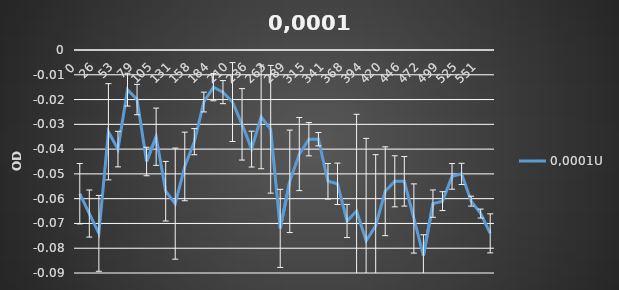
| Category | 0,0001U |
|---|---|
| 0.0 | -0.058 |
| 13.0 | -0.066 |
| 26.0 | -0.074 |
| 39.0 | -0.033 |
| 53.0 | -0.04 |
| 66.0 | -0.016 |
| 79.0 | -0.02 |
| 92.0 | -0.045 |
| 105.0 | -0.035 |
| 118.0 | -0.057 |
| 131.0 | -0.062 |
| 144.0 | -0.047 |
| 158.0 | -0.037 |
| 171.0 | -0.021 |
| 184.0 | -0.015 |
| 197.0 | -0.017 |
| 210.0 | -0.021 |
| 223.0 | -0.03 |
| 236.0 | -0.04 |
| 249.0 | -0.027 |
| 263.0 | -0.032 |
| 276.0 | -0.072 |
| 289.0 | -0.053 |
| 302.0 | -0.042 |
| 315.0 | -0.036 |
| 328.0 | -0.036 |
| 341.0 | -0.053 |
| 354.0 | -0.054 |
| 368.0 | -0.069 |
| 381.0 | -0.065 |
| 394.0 | -0.077 |
| 407.0 | -0.071 |
| 420.0 | -0.057 |
| 433.0 | -0.053 |
| 446.0 | -0.053 |
| 459.0 | -0.068 |
| 472.0 | -0.083 |
| 486.0 | -0.062 |
| 499.0 | -0.061 |
| 512.0 | -0.051 |
| 525.0 | -0.05 |
| 538.0 | -0.061 |
| 551.0 | -0.066 |
| 564.0 | -0.074 |